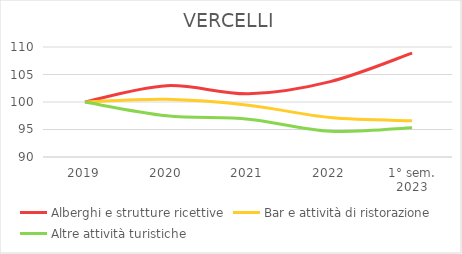
| Category | Alberghi e strutture ricettive | Bar e attività di ristorazione | Altre attività turistiche |
|---|---|---|---|
| 2019 | 100 | 100 | 100 |
| 2020 | 102.963 | 100.5 | 97.5 |
| 2021 | 101.481 | 99.417 | 96.875 |
| 2022 | 103.704 | 97.169 | 94.688 |
| 1° sem.
2023 | 108.889 | 96.586 | 95.312 |